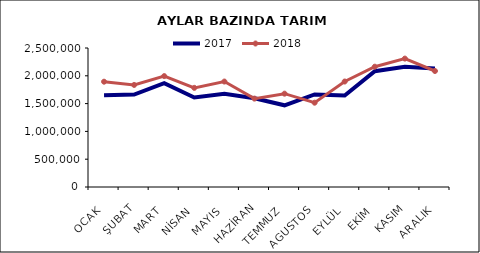
| Category | 2017 | 2018 |
|---|---|---|
| OCAK | 1652047.371 | 1893989.721 |
| ŞUBAT | 1662663.97 | 1835873.27 |
| MART | 1866050.152 | 1994477.999 |
| NİSAN | 1609068.375 | 1783183.202 |
| MAYIS | 1675476.368 | 1896616.607 |
| HAZİRAN | 1595970.92 | 1589714.633 |
| TEMMUZ | 1469298.933 | 1678743.412 |
| AGUSTOS | 1665277.404 | 1516461.415 |
| EYLÜL | 1644613.616 | 1897179.065 |
| EKİM | 2082399.944 | 2163556.744 |
| KASIM | 2162596.414 | 2309394.561 |
| ARALIK | 2131548.168 | 2086418.506 |